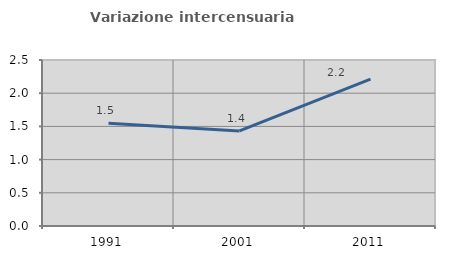
| Category | Variazione intercensuaria annua |
|---|---|
| 1991.0 | 1.547 |
| 2001.0 | 1.432 |
| 2011.0 | 2.211 |